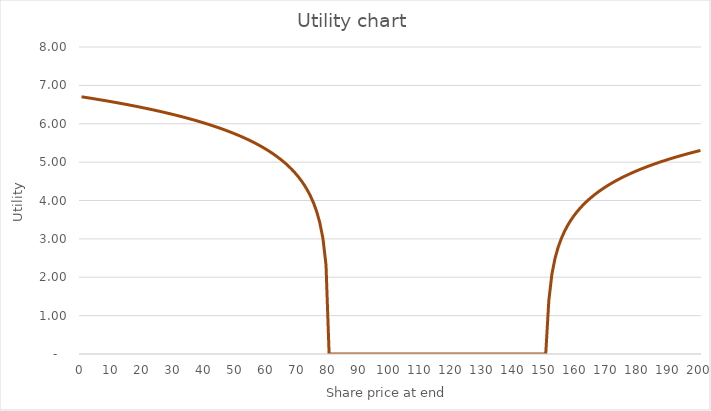
| Category | Utility |
|---|---|
| 0.0 | 6.703 |
| 1.0 | 6.69 |
| 2.0 | 6.677 |
| 3.0 | 6.664 |
| 4.0 | 6.651 |
| 5.0 | 6.638 |
| 6.0 | 6.625 |
| 7.0 | 6.611 |
| 8.0 | 6.597 |
| 9.0 | 6.583 |
| 10.0 | 6.569 |
| 11.0 | 6.555 |
| 12.0 | 6.54 |
| 13.0 | 6.525 |
| 14.0 | 6.51 |
| 15.0 | 6.495 |
| 16.0 | 6.479 |
| 17.0 | 6.464 |
| 18.0 | 6.448 |
| 19.0 | 6.431 |
| 20.0 | 6.415 |
| 21.0 | 6.398 |
| 22.0 | 6.381 |
| 23.0 | 6.364 |
| 24.0 | 6.346 |
| 25.0 | 6.328 |
| 26.0 | 6.31 |
| 27.0 | 6.291 |
| 28.0 | 6.272 |
| 29.0 | 6.252 |
| 30.0 | 6.233 |
| 31.0 | 6.212 |
| 32.0 | 6.192 |
| 33.0 | 6.171 |
| 34.0 | 6.149 |
| 35.0 | 6.127 |
| 36.0 | 6.105 |
| 37.0 | 6.082 |
| 38.0 | 6.058 |
| 39.0 | 6.034 |
| 40.0 | 6.009 |
| 41.0 | 5.984 |
| 42.0 | 5.958 |
| 43.0 | 5.932 |
| 44.0 | 5.904 |
| 45.0 | 5.876 |
| 46.0 | 5.847 |
| 47.0 | 5.817 |
| 48.0 | 5.786 |
| 49.0 | 5.755 |
| 50.0 | 5.722 |
| 51.0 | 5.688 |
| 52.0 | 5.653 |
| 53.0 | 5.616 |
| 54.0 | 5.579 |
| 55.0 | 5.539 |
| 56.0 | 5.499 |
| 57.0 | 5.456 |
| 58.0 | 5.412 |
| 59.0 | 5.365 |
| 60.0 | 5.316 |
| 61.0 | 5.265 |
| 62.0 | 5.211 |
| 63.0 | 5.154 |
| 64.0 | 5.093 |
| 65.0 | 5.029 |
| 66.0 | 4.96 |
| 67.0 | 4.886 |
| 68.0 | 4.806 |
| 69.0 | 4.719 |
| 70.0 | 4.623 |
| 71.0 | 4.518 |
| 72.0 | 4.4 |
| 73.0 | 4.267 |
| 74.0 | 4.112 |
| 75.0 | 3.93 |
| 76.0 | 3.707 |
| 77.0 | 3.419 |
| 78.0 | 3.014 |
| 79.0 | 2.321 |
| 80.0 | 0 |
| 81.0 | 0 |
| 82.0 | 0 |
| 83.0 | 0 |
| 84.0 | 0 |
| 85.0 | 0 |
| 86.0 | 0 |
| 87.0 | 0 |
| 88.0 | 0 |
| 89.0 | 0 |
| 90.0 | 0 |
| 91.0 | 0 |
| 92.0 | 0 |
| 93.0 | 0 |
| 94.0 | 0 |
| 95.0 | 0 |
| 96.0 | 0 |
| 97.0 | 0 |
| 98.0 | 0 |
| 99.0 | 0 |
| 100.0 | 0 |
| 101.0 | 0 |
| 102.0 | 0 |
| 103.0 | 0 |
| 104.0 | 0 |
| 105.0 | 0 |
| 106.0 | 0 |
| 107.0 | 0 |
| 108.0 | 0 |
| 109.0 | 0 |
| 110.0 | 0 |
| 111.0 | 0 |
| 112.0 | 0 |
| 113.0 | 0 |
| 114.0 | 0 |
| 115.0 | 0 |
| 116.0 | 0 |
| 117.0 | 0 |
| 118.0 | 0 |
| 119.0 | 0 |
| 120.0 | 0 |
| 121.0 | 0 |
| 122.0 | 0 |
| 123.0 | 0 |
| 124.0 | 0 |
| 125.0 | 0 |
| 126.0 | 0 |
| 127.0 | 0 |
| 128.0 | 0 |
| 129.0 | 0 |
| 130.0 | 0 |
| 131.0 | 0 |
| 132.0 | 0 |
| 133.0 | 0 |
| 134.0 | 0 |
| 135.0 | 0 |
| 136.0 | 0 |
| 137.0 | 0 |
| 138.0 | 0 |
| 139.0 | 0 |
| 140.0 | 0 |
| 141.0 | 0 |
| 142.0 | 0 |
| 143.0 | 0 |
| 144.0 | 0 |
| 145.0 | 0 |
| 146.0 | 0 |
| 147.0 | 0 |
| 148.0 | 0 |
| 149.0 | 0 |
| 150.0 | 0 |
| 151.0 | 1.392 |
| 152.0 | 2.085 |
| 153.0 | 2.491 |
| 154.0 | 2.779 |
| 155.0 | 3.002 |
| 156.0 | 3.184 |
| 157.0 | 3.338 |
| 158.0 | 3.472 |
| 159.0 | 3.589 |
| 160.0 | 3.695 |
| 161.0 | 3.79 |
| 162.0 | 3.877 |
| 163.0 | 3.957 |
| 164.0 | 4.031 |
| 165.0 | 4.1 |
| 166.0 | 4.165 |
| 167.0 | 4.225 |
| 168.0 | 4.283 |
| 169.0 | 4.337 |
| 170.0 | 4.388 |
| 171.0 | 4.437 |
| 172.0 | 4.483 |
| 173.0 | 4.528 |
| 174.0 | 4.57 |
| 175.0 | 4.611 |
| 176.0 | 4.65 |
| 177.0 | 4.688 |
| 178.0 | 4.724 |
| 179.0 | 4.76 |
| 180.0 | 4.793 |
| 181.0 | 4.826 |
| 182.0 | 4.858 |
| 183.0 | 4.889 |
| 184.0 | 4.919 |
| 185.0 | 4.948 |
| 186.0 | 4.976 |
| 187.0 | 5.003 |
| 188.0 | 5.03 |
| 189.0 | 5.056 |
| 190.0 | 5.081 |
| 191.0 | 5.106 |
| 192.0 | 5.13 |
| 193.0 | 5.153 |
| 194.0 | 5.176 |
| 195.0 | 5.199 |
| 196.0 | 5.221 |
| 197.0 | 5.242 |
| 198.0 | 5.263 |
| 199.0 | 5.284 |
| 200.0 | 5.304 |